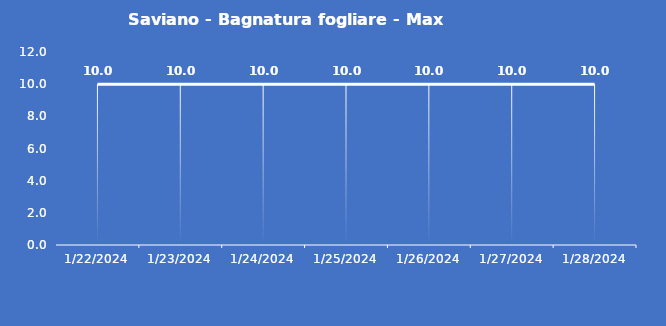
| Category | Saviano - Bagnatura fogliare - Max (min) |
|---|---|
| 1/22/24 | 10 |
| 1/23/24 | 10 |
| 1/24/24 | 10 |
| 1/25/24 | 10 |
| 1/26/24 | 10 |
| 1/27/24 | 10 |
| 1/28/24 | 10 |